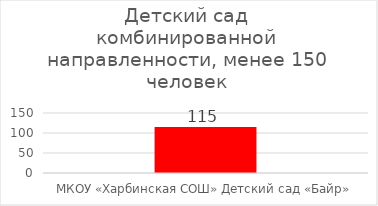
| Category | ИТОГО |
|---|---|
| МКОУ «Харбинская СОШ» Детский сад «Байр» | 115 |